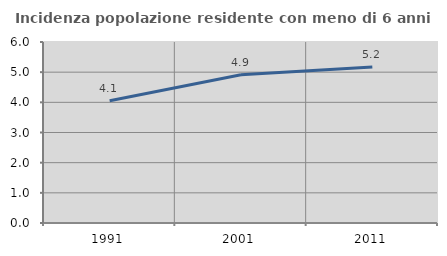
| Category | Incidenza popolazione residente con meno di 6 anni |
|---|---|
| 1991.0 | 4.051 |
| 2001.0 | 4.912 |
| 2011.0 | 5.17 |